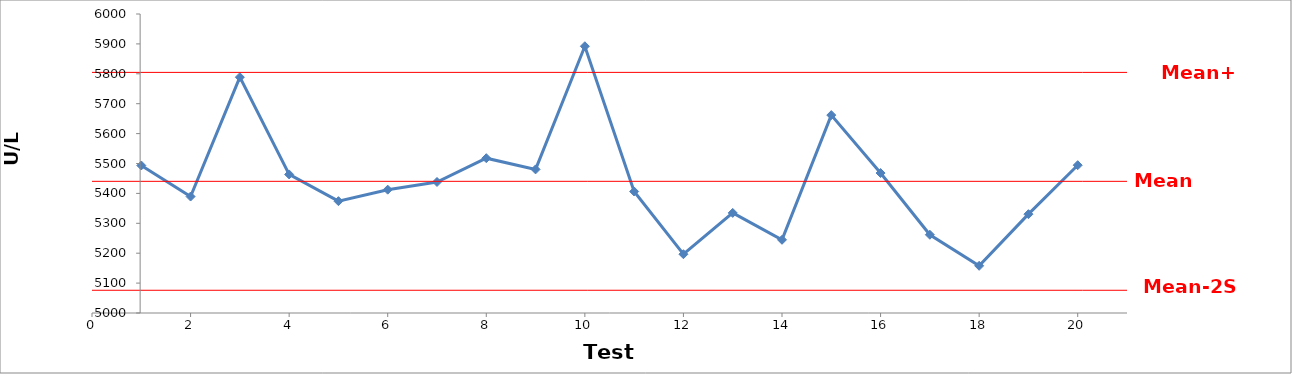
| Category | 09-Dec-10 |
|---|---|
| 0 | 5493.384 |
| 1 | 5389.488 |
| 2 | 5788.692 |
| 3 | 5463.432 |
| 4 | 5374.044 |
| 5 | 5412.42 |
| 6 | 5438.16 |
| 7 | 5517.72 |
| 8 | 5480.28 |
| 9 | 5892.12 |
| 10 | 5406.336 |
| 11 | 5196.672 |
| 12 | 5334.732 |
| 13 | 5244.876 |
| 14 | 5661.864 |
| 15 | 5468.112 |
| 16 | 5261.724 |
| 17 | 5157.828 |
| 18 | 5330.52 |
| 19 | 5494.32 |